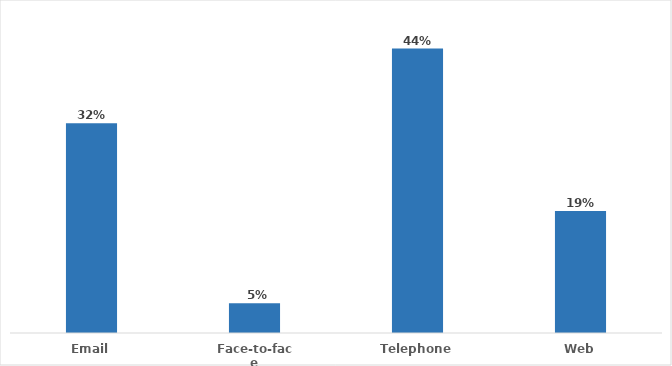
| Category | Series 0 |
|---|---|
| Email | 0.325 |
| Face-to-face | 0.046 |
| Telephone | 0.44 |
| Web | 0.189 |